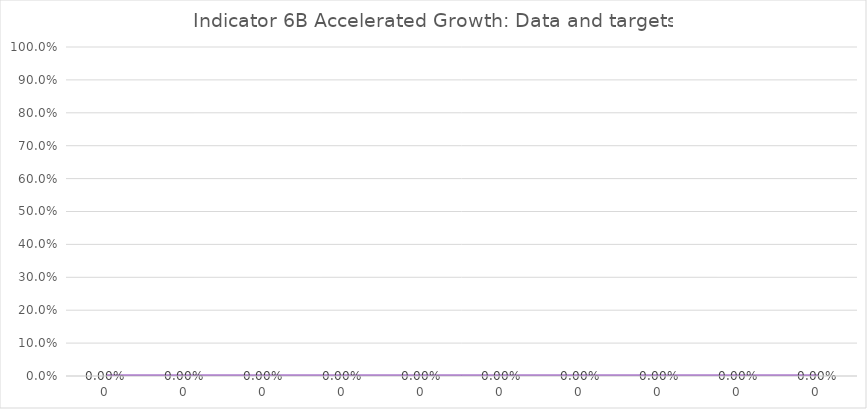
| Category | Indicator 6B data 
and targets |
|---|---|
| 0.0 | 0 |
| 0.0 | 0 |
| 0.0 | 0 |
| 0.0 | 0 |
| 0.0 | 0 |
| 0.0 | 0 |
| 0.0 | 0 |
| 0.0 | 0 |
| 0.0 | 0 |
| 0.0 | 0 |